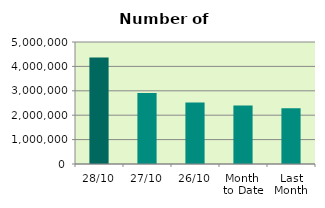
| Category | Series 0 |
|---|---|
| 28/10 | 4368528 |
| 27/10 | 2911788 |
| 26/10 | 2517492 |
| Month 
to Date | 2394858.7 |
| Last
Month | 2288803 |